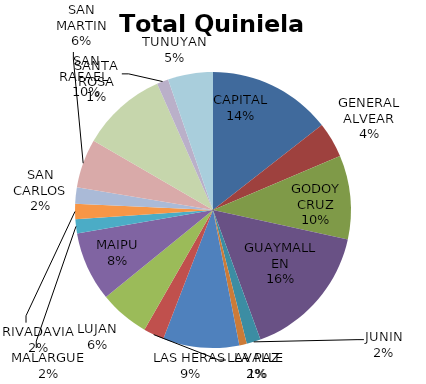
| Category | Total Quiniela Beneficio |
|---|---|
| CAPITAL | 3853624.57 |
| GENERAL ALVEAR | 1106867.48 |
| GODOY CRUZ | 2619703.67 |
| GUAYMALLEN | 4262485.38 |
| JUNIN | 439659.53 |
| LA PAZ | 233994.87 |
| LAS HERAS | 2379376.24 |
| LAVALLE | 643983.85 |
| LUJAN | 1559578.15 |
| MAIPU | 2173670.89 |
| MALARGUE | 439730.96 |
| RIVADAVIA | 478613.05 |
| SAN CARLOS | 509858.94 |
| SAN MARTIN | 1526914.75 |
| SAN RAFAEL  | 2666777.92 |
| SANTA ROSA | 363196.04 |
| TUNUYAN | 1405802.17 |